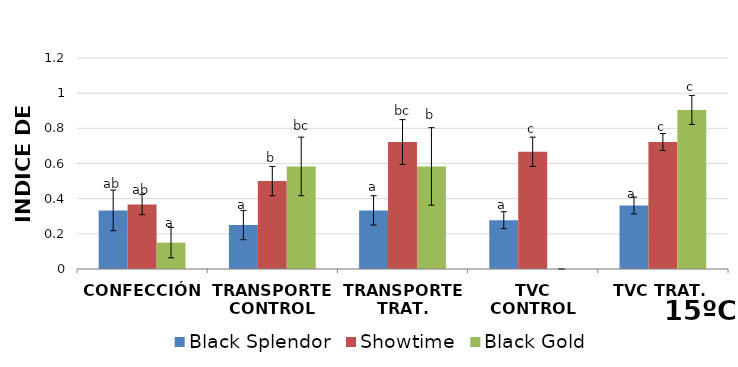
| Category | Black Splendor | Showtime | Black Gold |
|---|---|---|---|
| CONFECCIÓN | 0.333 | 0.367 | 0.15 |
| TRANSPORTE CONTROL | 0.25 | 0.5 | 0.583 |
| TRANSPORTE TRAT. | 0.333 | 0.722 | 0.583 |
| TVC CONTROL | 0.278 | 0.667 | 0 |
| TVC TRAT. | 0.361 | 0.722 | 0.905 |